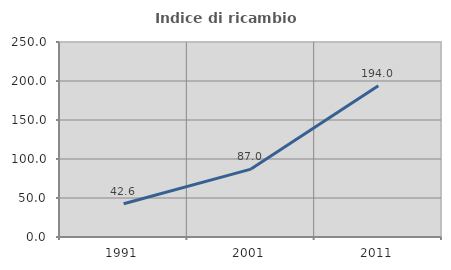
| Category | Indice di ricambio occupazionale  |
|---|---|
| 1991.0 | 42.59 |
| 2001.0 | 87.026 |
| 2011.0 | 193.976 |